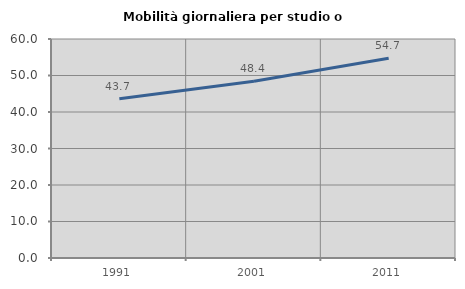
| Category | Mobilità giornaliera per studio o lavoro |
|---|---|
| 1991.0 | 43.651 |
| 2001.0 | 48.444 |
| 2011.0 | 54.701 |